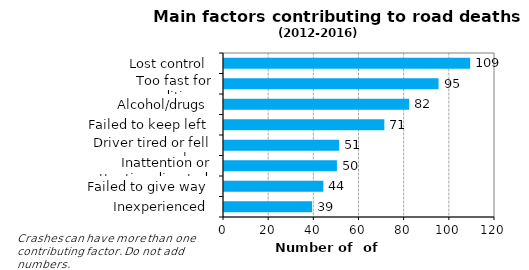
| Category | Series 1 |
|---|---|
| Lost control | 109 |
| Too fast for conditions  | 95 |
| Alcohol/drugs | 82 |
| Failed to keep left | 71 |
| Driver tired or fell asleep | 51 |
| Inattention or attention diverted | 50 |
| Failed to give way | 44 |
| Inexperienced | 39 |